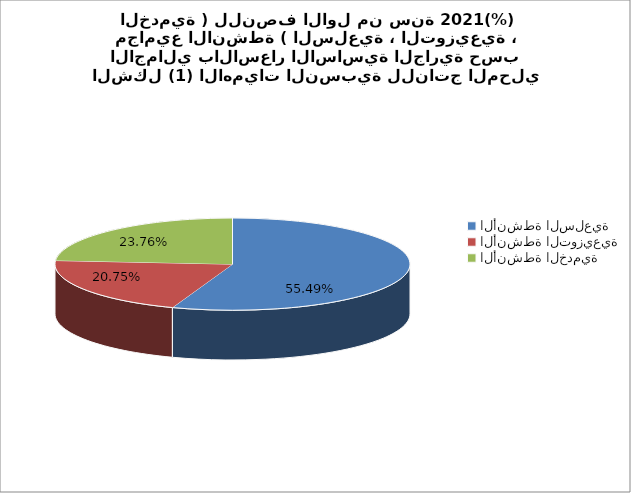
| Category | Series 0 |
|---|---|
| الأنشطة السلعية | 76505.2 |
| الأنشطة التوزيعية | 28606.7 |
| الأنشطة الخدمية | 32751.3 |